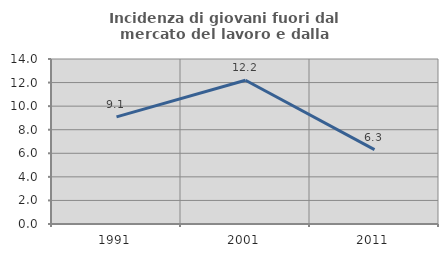
| Category | Incidenza di giovani fuori dal mercato del lavoro e dalla formazione  |
|---|---|
| 1991.0 | 9.091 |
| 2001.0 | 12.195 |
| 2011.0 | 6.306 |